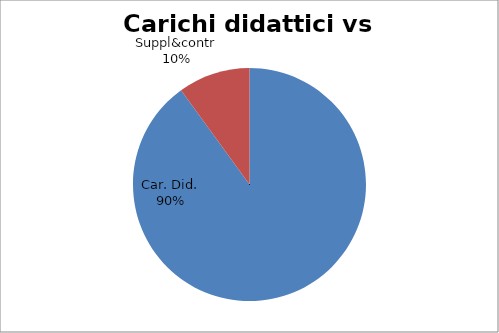
| Category | Series 0 |
|---|---|
| Car. Did. | 0.9 |
| Suppl&contr | 0.1 |